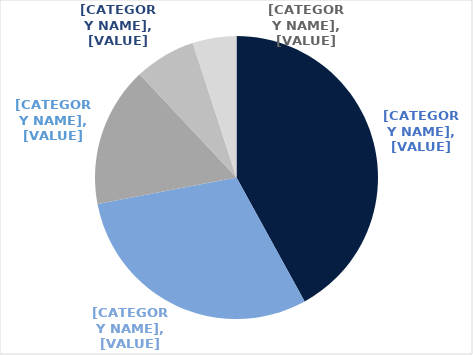
| Category | Series 0 |
|---|---|
| Regional | 0.42 |
| Sub regional | 0.3 |
| Outlet | 0.16 |
| Neighbourhood | 0.07 |
| CBD Retail | 0.05 |